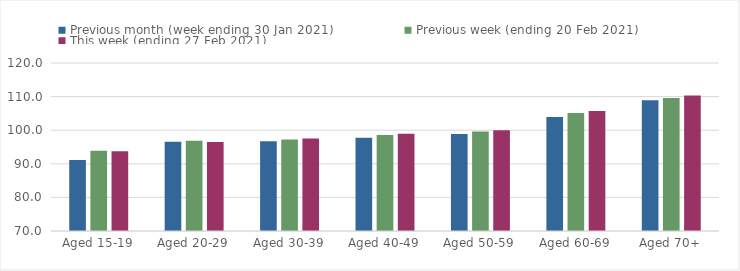
| Category | Previous month (week ending 30 Jan 2021) | Previous week (ending 20 Feb 2021) | This week (ending 27 Feb 2021) |
|---|---|---|---|
| Aged 15-19 | 91.15 | 93.92 | 93.76 |
| Aged 20-29 | 96.57 | 96.84 | 96.46 |
| Aged 30-39 | 96.68 | 97.26 | 97.52 |
| Aged 40-49 | 97.73 | 98.57 | 98.98 |
| Aged 50-59 | 98.86 | 99.63 | 99.96 |
| Aged 60-69 | 103.94 | 105.14 | 105.71 |
| Aged 70+ | 108.93 | 109.58 | 110.3 |